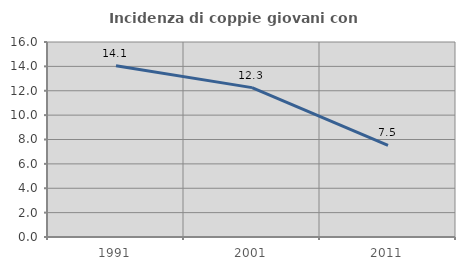
| Category | Incidenza di coppie giovani con figli |
|---|---|
| 1991.0 | 14.06 |
| 2001.0 | 12.255 |
| 2011.0 | 7.514 |